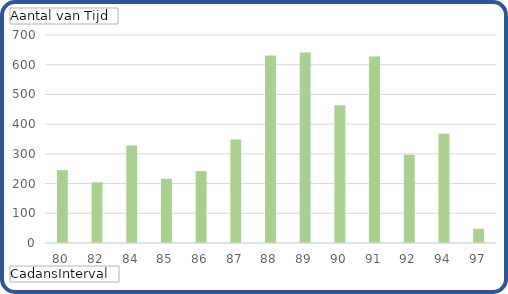
| Category | Totaal |
|---|---|
| 80 | 245 |
| 82 | 204 |
| 84 | 328 |
| 85 | 216 |
| 86 | 242 |
| 87 | 348 |
| 88 | 631 |
| 89 | 641 |
| 90 | 464 |
| 91 | 628 |
| 92 | 297 |
| 94 | 368 |
| 97 | 48 |